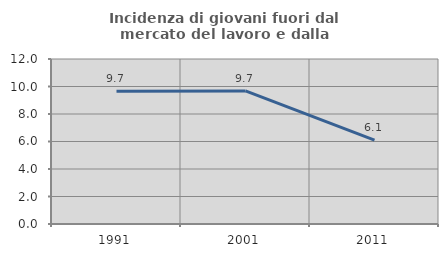
| Category | Incidenza di giovani fuori dal mercato del lavoro e dalla formazione  |
|---|---|
| 1991.0 | 9.659 |
| 2001.0 | 9.677 |
| 2011.0 | 6.098 |